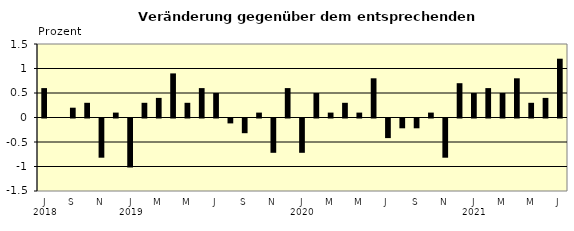
| Category | Series 0 |
|---|---|
| 0 | 0.6 |
| 1 | 0 |
| 2 | 0.2 |
| 3 | 0.3 |
| 4 | -0.8 |
| 5 | 0.1 |
| 6 | -1 |
| 7 | 0.3 |
| 8 | 0.4 |
| 9 | 0.9 |
| 10 | 0.3 |
| 11 | 0.6 |
| 12 | 0.5 |
| 13 | -0.1 |
| 14 | -0.3 |
| 15 | 0.1 |
| 16 | -0.7 |
| 17 | 0.6 |
| 18 | -0.7 |
| 19 | 0.5 |
| 20 | 0.1 |
| 21 | 0.3 |
| 22 | 0.1 |
| 23 | 0.8 |
| 24 | -0.4 |
| 25 | -0.2 |
| 26 | -0.2 |
| 27 | 0.1 |
| 28 | -0.8 |
| 29 | 0.7 |
| 30 | 0.5 |
| 31 | 0.6 |
| 32 | 0.5 |
| 33 | 0.8 |
| 34 | 0.3 |
| 35 | 0.4 |
| 36 | 1.2 |